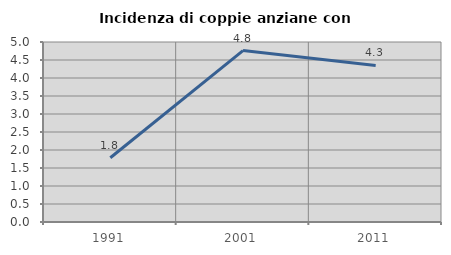
| Category | Incidenza di coppie anziane con figli |
|---|---|
| 1991.0 | 1.786 |
| 2001.0 | 4.762 |
| 2011.0 | 4.348 |